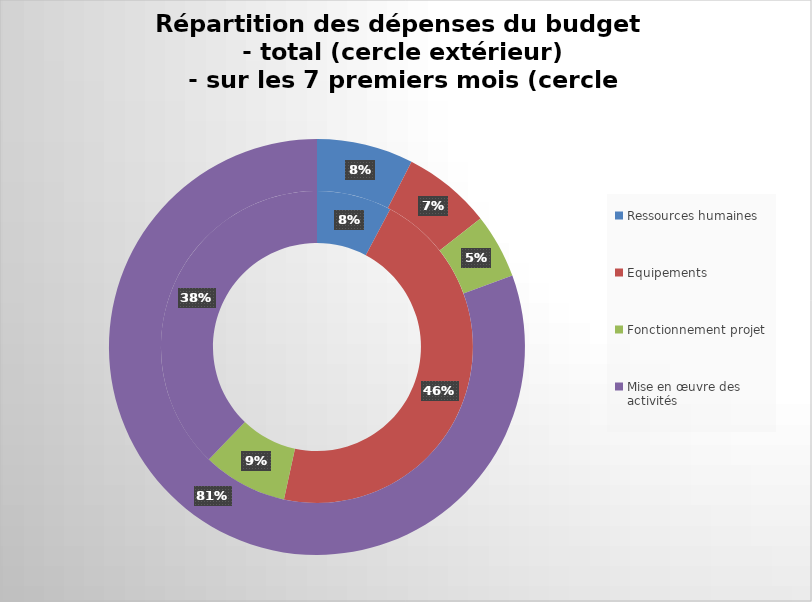
| Category | % budget 7 mois | % budget total |
|---|---|---|
| Ressources humaines  | 0.078 | 0.075 |
| Equipements  | 0.456 | 0.069 |
| Fonctionnement projet | 0.088 | 0.05 |
| Mise en œuvre des activités | 0.378 | 0.806 |